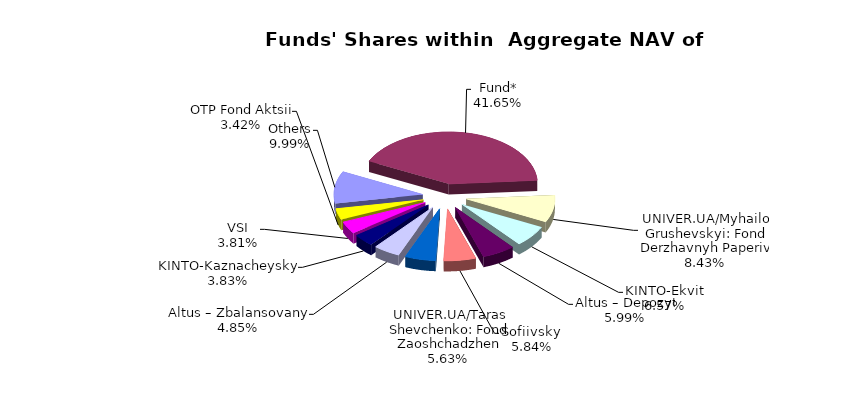
| Category | Series 0 | Series 1 |
|---|---|---|
| Others | 5054796.78 | 0.092 |
| Fund* | 21074951.357 | 0.383 |
| UNIVER.UA/Myhailo Grushevskyi: Fond Derzhavnyh Paperiv | 4264060.03 | 0.078 |
| KINTO-Ekviti | 3323570.59 | 0.06 |
| Altus – Depozyt | 3033087.14 | 0.055 |
| Sofiivskyi | 2955252.323 | 0.054 |
| UNIVER.UA/Taras Shevchenko: Fond Zaoshchadzhen | 2846576.73 | 0.052 |
| Altus – Zbalansovanyi | 2454256.57 | 0.045 |
| KINTO-Kaznacheyskyi | 1938707.89 | 0.035 |
| VSI | 1925528.86 | 0.035 |
| OTP Fond Aktsii | 1729826.6 | 0.031 |